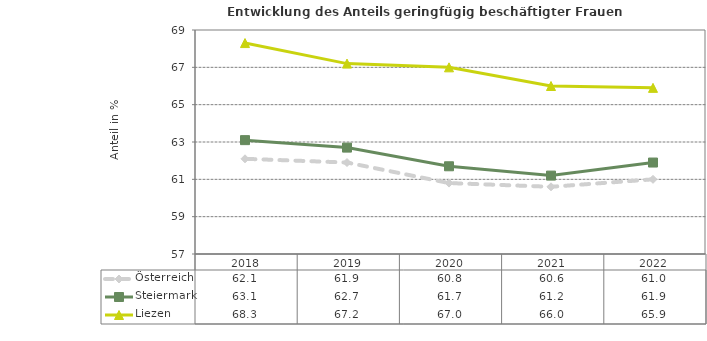
| Category | Österreich | Steiermark | Liezen |
|---|---|---|---|
| 2022.0 | 61 | 61.9 | 65.9 |
| 2021.0 | 60.6 | 61.2 | 66 |
| 2020.0 | 60.8 | 61.7 | 67 |
| 2019.0 | 61.9 | 62.7 | 67.2 |
| 2018.0 | 62.1 | 63.1 | 68.3 |